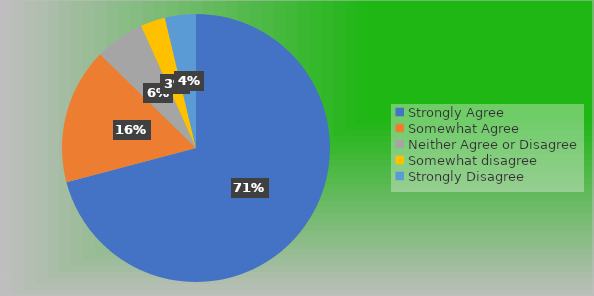
| Category | Series 0 |
|---|---|
| Strongly Agree | 95 |
| Somewhat Agree | 22 |
| Neither Agree or Disagree | 8 |
| Somewhat disagree | 4 |
| Strongly Disagree | 5 |